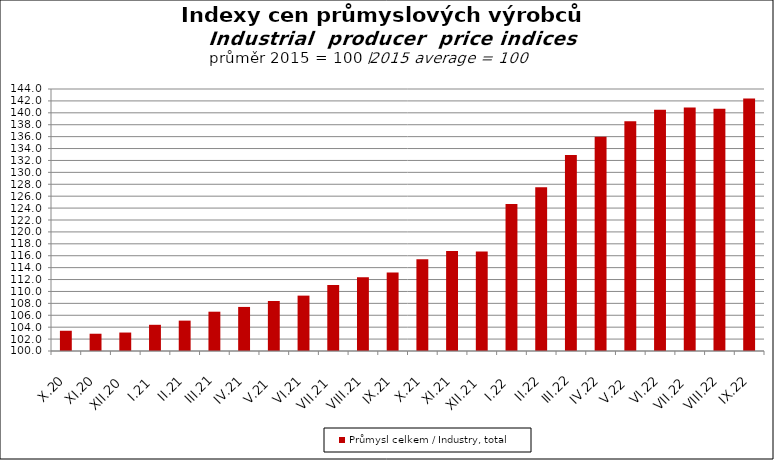
| Category | Průmysl celkem / Industry, total |
|---|---|
| X.20 | 103.4 |
| XI.20 | 102.9 |
| XII.20 | 103.1 |
| I.21 | 104.4 |
| II.21 | 105.1 |
| III.21 | 106.6 |
| IV.21 | 107.4 |
| V.21 | 108.4 |
| VI.21 | 109.3 |
| VII.21 | 111.1 |
| VIII.21 | 112.4 |
| IX.21 | 113.2 |
| X.21 | 115.4 |
| XI.21 | 116.8 |
| XII.21 | 116.7 |
| I.22 | 124.7 |
| II.22 | 127.5 |
| III.22 | 132.9 |
| IV.22 | 136 |
| V.22 | 138.6 |
| VI.22 | 140.5 |
| VII.22 | 140.9 |
| VIII.22 | 140.7 |
| IX.22 | 142.4 |